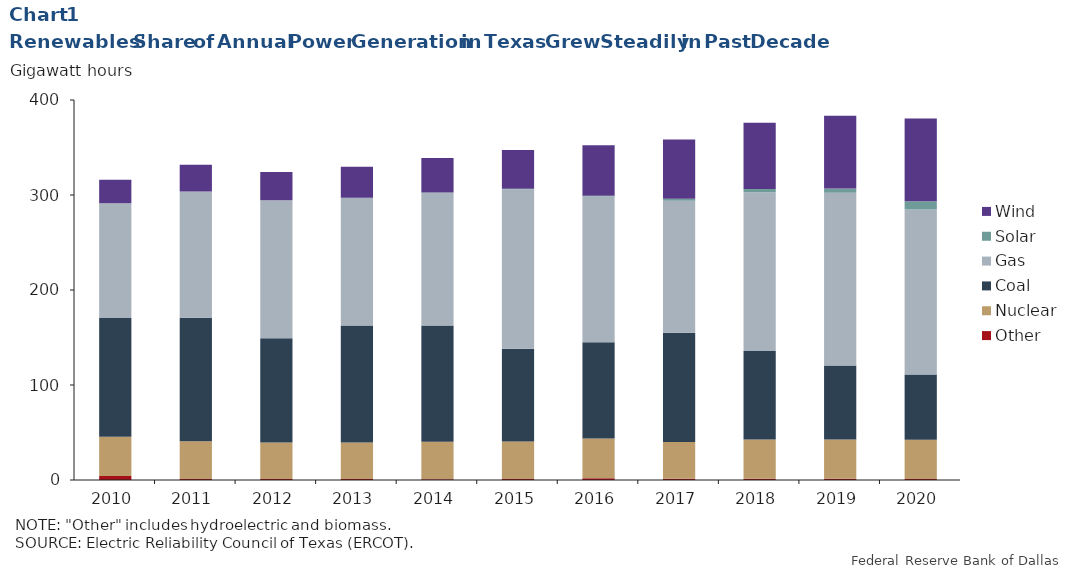
| Category | Other | Nuclear | Coal | Gas | Solar | Wind |
|---|---|---|---|---|---|---|
| 2010-01-01 | 4.318 | 41.334 | 124.949 | 120.732 | 0 | 24.713 |
| 2011-01-01 | 1.059 | 39.648 | 130.083 | 132.872 | 0 | 28.295 |
| 2012-01-01 | 1.154 | 38.441 | 109.747 | 145.002 | 0.123 | 29.803 |
| 2013-01-01 | 1.014 | 38.343 | 123.232 | 134.357 | 0.149 | 32.705 |
| 2014-01-01 | 0.865 | 39.287 | 122.483 | 139.762 | 0.303 | 36.142 |
| 2015-01-01 | 1.127 | 39.384 | 97.655 | 167.894 | 0.421 | 40.786 |
| 2016-01-01 | 1.714 | 42.091 | 101.107 | 153.492 | 0.837 | 53.146 |
| 2017-01-01 | 1.427 | 38.504 | 115.141 | 138.844 | 2.258 | 62.203 |
| 2018-01-01 | 1.403 | 41.125 | 93.249 | 167.206 | 3.24 | 69.796 |
| 2019-01-01 | 1.4 | 41.314 | 77.857 | 181.77 | 4.398 | 76.708 |
| 2020-01-01 | 0.994 | 41.459 | 68.514 | 173.797 | 8.749 | 87.09 |